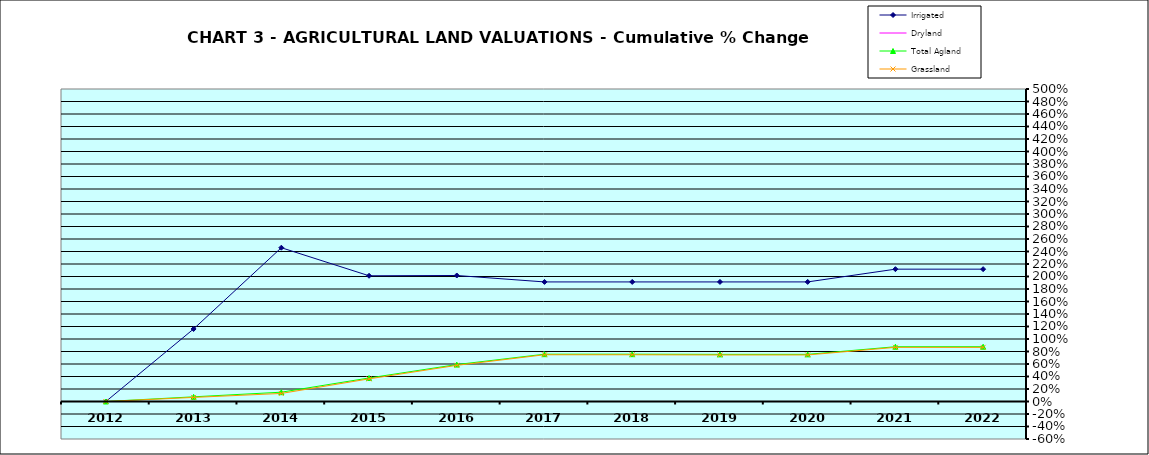
| Category | Irrigated | Dryland | Total Agland | Grassland |
|---|---|---|---|---|
| 2012.0 | 0 | 0 | 0 | 0 |
| 2013.0 | 1.16 | 0 | 0.075 | 0.065 |
| 2014.0 | 2.461 | 0 | 0.149 | 0.129 |
| 2015.0 | 2.012 | 0 | 0.376 | 0.362 |
| 2016.0 | 2.016 | 0 | 0.591 | 0.579 |
| 2017.0 | 1.913 | 0 | 0.757 | 0.748 |
| 2018.0 | 1.913 | 0 | 0.757 | 0.748 |
| 2019.0 | 1.913 | 0 | 0.754 | 0.745 |
| 2020.0 | 1.913 | 0 | 0.754 | 0.745 |
| 2021.0 | 2.117 | 0 | 0.876 | 0.866 |
| 2022.0 | 2.117 | 0 | 0.877 | 0.866 |